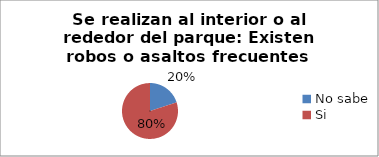
| Category | Series 0 |
|---|---|
| No sabe | 0.2 |
| Si | 0.8 |